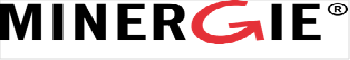
| Category | Series 1 | Series 0 |
|---|---|---|
| 0 | 1 | 0 |